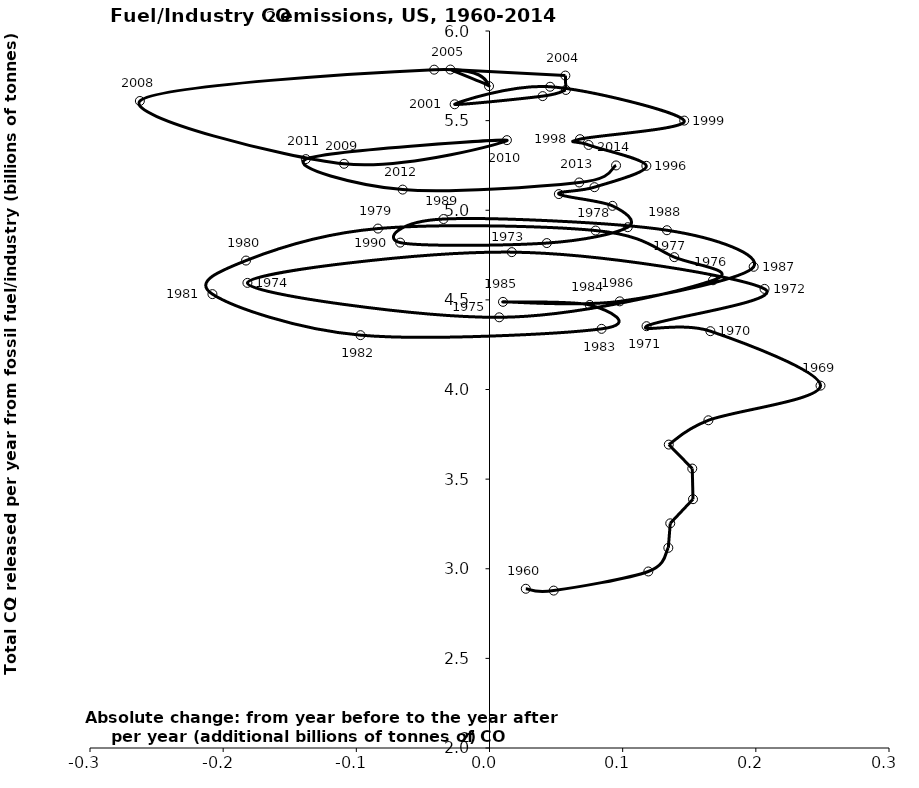
| Category | Series 0 |
|---|---|
| 0.027258328000000054 | 2.888 |
| 0.048216408000000044 | 2.878 |
| 0.11926503199999994 | 2.985 |
| 0.13428376799999997 | 3.117 |
| 0.1357347120000001 | 3.253 |
| 0.15281627999999992 | 3.388 |
| 0.15226851200000002 | 3.559 |
| 0.13462818400000032 | 3.693 |
| 0.1643853599999998 | 3.828 |
| 0.24857125599999996 | 4.021 |
| 0.1658747759999999 | 4.325 |
| 0.11792767199999998 | 4.353 |
| 0.20654334399999996 | 4.561 |
| 0.01675363999999968 | 4.766 |
| -0.1817838639999998 | 4.595 |
| 0.0073005199999998105 | 4.403 |
| 0.167844176 | 4.609 |
| 0.13876667200000048 | 4.738 |
| 0.0796865040000001 | 4.887 |
| -0.0837572080000002 | 4.898 |
| -0.1828482560000002 | 4.719 |
| -0.20806024 | 4.532 |
| -0.09688165599999987 | 4.303 |
| 0.08415292000000019 | 4.338 |
| 0.0752768800000001 | 4.472 |
| 0.010127295999999841 | 4.489 |
| 0.09782879999999983 | 4.492 |
| 0.19836895999999982 | 4.685 |
| 0.13324502400000027 | 4.889 |
| -0.03453319999999982 | 4.951 |
| -0.0670621920000003 | 4.819 |
| 0.04303001600000034 | 4.817 |
| 0.10382859999999994 | 4.906 |
| 0.09233463199999958 | 5.025 |
| 0.052080096000000076 | 5.09 |
| 0.07881447199999991 | 5.129 |
| 0.11780126400000013 | 5.248 |
| 0.07438836000000038 | 5.364 |
| 0.06792139999999991 | 5.397 |
| 0.14621741599999982 | 5.5 |
| 0.045525200000000154 | 5.689 |
| -0.026166455999999894 | 5.591 |
| 0.039921112000000036 | 5.637 |
| 0.057336104 | 5.671 |
| 0.05696603999999983 | 5.751 |
| -0.029370624000000234 | 5.785 |
| -0.0003480799999997508 | 5.693 |
| -0.041553423999999506 | 5.784 |
| -0.26254758400000044 | 5.61 |
| -0.10920002400000017 | 5.259 |
| 0.013076816000000324 | 5.391 |
| -0.1379349440000004 | 5.285 |
| -0.0652063759999999 | 5.115 |
| 0.0673663040000001 | 5.155 |
| 0.09504049599999931 | 5.25 |